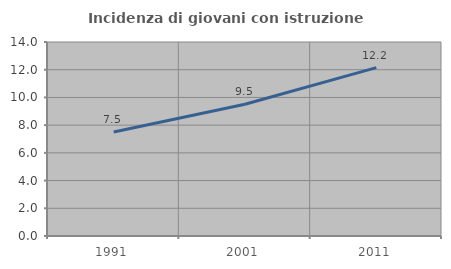
| Category | Incidenza di giovani con istruzione universitaria |
|---|---|
| 1991.0 | 7.505 |
| 2001.0 | 9.509 |
| 2011.0 | 12.155 |